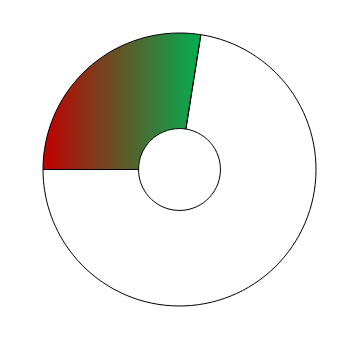
| Category | Series 0 |
|---|---|
| 0 | 99 |
| 1 | 261 |